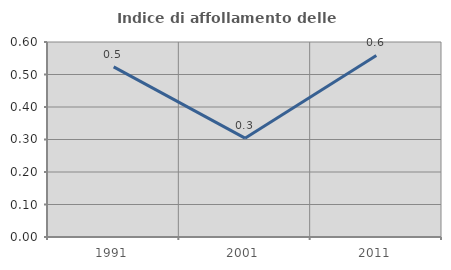
| Category | Indice di affollamento delle abitazioni  |
|---|---|
| 1991.0 | 0.523 |
| 2001.0 | 0.304 |
| 2011.0 | 0.559 |